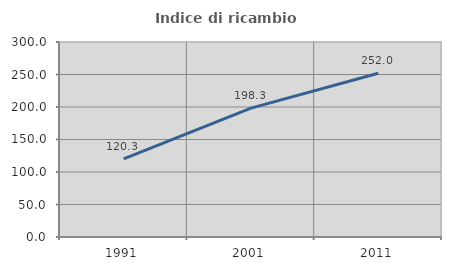
| Category | Indice di ricambio occupazionale  |
|---|---|
| 1991.0 | 120.287 |
| 2001.0 | 198.333 |
| 2011.0 | 251.989 |